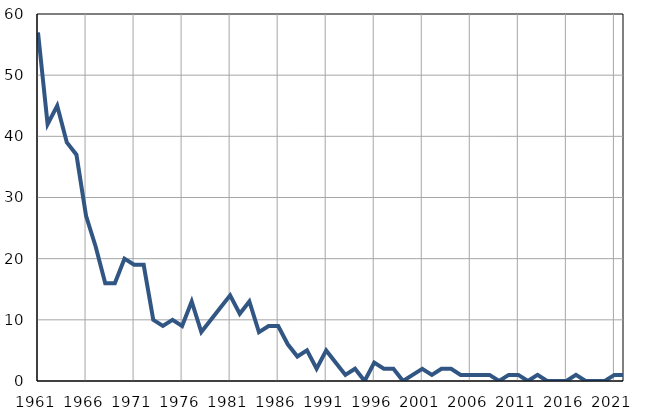
| Category | Infants
deaths |
|---|---|
| 1961.0 | 57 |
| 1962.0 | 42 |
| 1963.0 | 45 |
| 1964.0 | 39 |
| 1965.0 | 37 |
| 1966.0 | 27 |
| 1967.0 | 22 |
| 1968.0 | 16 |
| 1969.0 | 16 |
| 1970.0 | 20 |
| 1971.0 | 19 |
| 1972.0 | 19 |
| 1973.0 | 10 |
| 1974.0 | 9 |
| 1975.0 | 10 |
| 1976.0 | 9 |
| 1977.0 | 13 |
| 1978.0 | 8 |
| 1979.0 | 10 |
| 1980.0 | 12 |
| 1981.0 | 14 |
| 1982.0 | 11 |
| 1983.0 | 13 |
| 1984.0 | 8 |
| 1985.0 | 9 |
| 1986.0 | 9 |
| 1987.0 | 6 |
| 1988.0 | 4 |
| 1989.0 | 5 |
| 1990.0 | 2 |
| 1991.0 | 5 |
| 1992.0 | 3 |
| 1993.0 | 1 |
| 1994.0 | 2 |
| 1995.0 | 0 |
| 1996.0 | 3 |
| 1997.0 | 2 |
| 1998.0 | 2 |
| 1999.0 | 0 |
| 2000.0 | 1 |
| 2001.0 | 2 |
| 2002.0 | 1 |
| 2003.0 | 2 |
| 2004.0 | 2 |
| 2005.0 | 1 |
| 2006.0 | 1 |
| 2007.0 | 1 |
| 2008.0 | 1 |
| 2009.0 | 0 |
| 2010.0 | 1 |
| 2011.0 | 1 |
| 2012.0 | 0 |
| 2013.0 | 1 |
| 2014.0 | 0 |
| 2015.0 | 0 |
| 2016.0 | 0 |
| 2017.0 | 1 |
| 2018.0 | 0 |
| 2019.0 | 0 |
| 2020.0 | 0 |
| 2021.0 | 1 |
| 2022.0 | 1 |